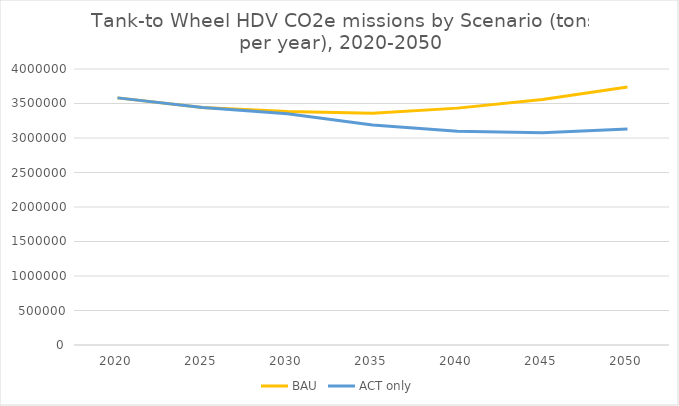
| Category | BAU | ACT only |
|---|---|---|
| 2020.0 | 3581577.285 | 3581577.285 |
| 2025.0 | 3442085.675 | 3442085.675 |
| 2030.0 | 3384273.022 | 3352494.597 |
| 2035.0 | 3357418.699 | 3187828.006 |
| 2040.0 | 3432957.239 | 3099621.414 |
| 2045.0 | 3557147.985 | 3075159.607 |
| 2050.0 | 3737825.705 | 3131199.144 |